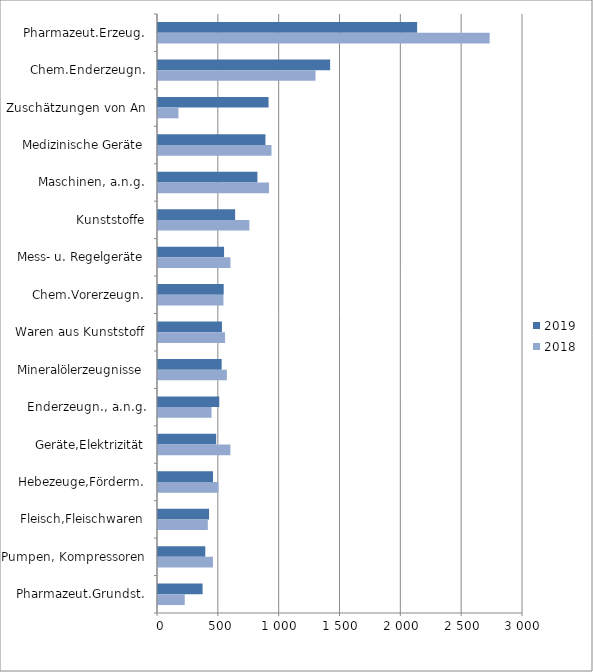
| Category | 2019 | 2018 |
|---|---|---|
| Pharmazeut.Erzeug. | 2130.031 | 2726.024 |
| Chem.Enderzeugn. | 1414.741 | 1294.777 |
| Zuschätzungen von An | 908.61 | 168.055 |
| Medizinische Geräte | 882.992 | 932.931 |
| Maschinen, a.n.g. | 817.081 | 912.27 |
| Kunststoffe | 633.945 | 750.893 |
| Mess- u. Regelgeräte | 542.916 | 595.545 |
| Chem.Vorerzeugn. | 539.906 | 538.176 |
| Waren aus Kunststoff | 525.57 | 551.41 |
| Mineralölerzeugnisse | 523.275 | 565.951 |
| Enderzeugn., a.n.g. | 503.693 | 440.112 |
| Geräte,Elektrizität | 478.075 | 595.144 |
| Hebezeuge,Förderm. | 452.171 | 496.733 |
| Fleisch,Fleischwaren | 419.741 | 409.353 |
| Pumpen, Kompressoren | 388.659 | 451.583 |
| Pharmazeut.Grundst. | 366.419 | 219.898 |